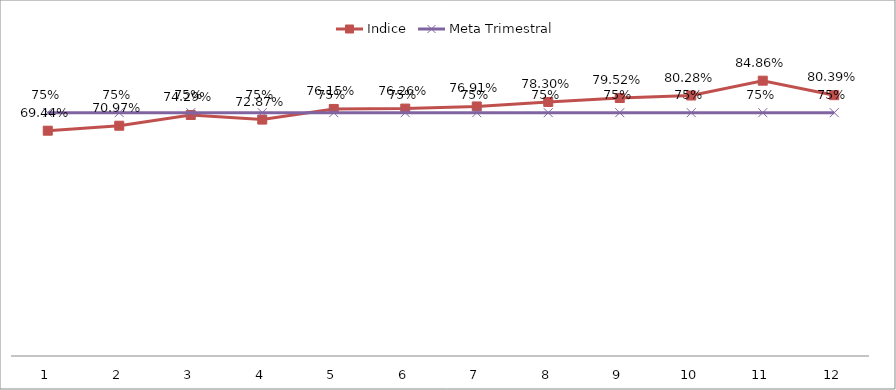
| Category | Indice | Meta Trimestral |
|---|---|---|
| 0 | 0.694 | 0.75 |
| 1 | 0.71 | 0.75 |
| 2 | 0.743 | 0.75 |
| 3 | 0.729 | 0.75 |
| 4 | 0.761 | 0.75 |
| 5 | 0.763 | 0.75 |
| 6 | 0.769 | 0.75 |
| 7 | 0.783 | 0.75 |
| 8 | 0.795 | 0.75 |
| 9 | 0.803 | 0.75 |
| 10 | 0.849 | 0.75 |
| 11 | 0.804 | 0.75 |